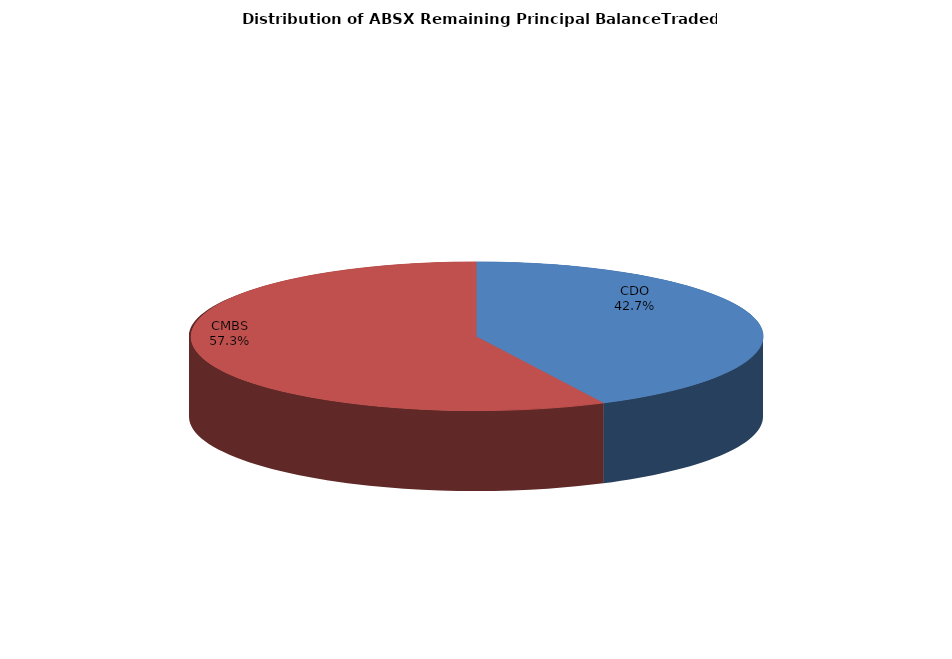
| Category | Series 0 |
|---|---|
| CDO | 1361574786.626 |
| CMBS | 1827856924.558 |